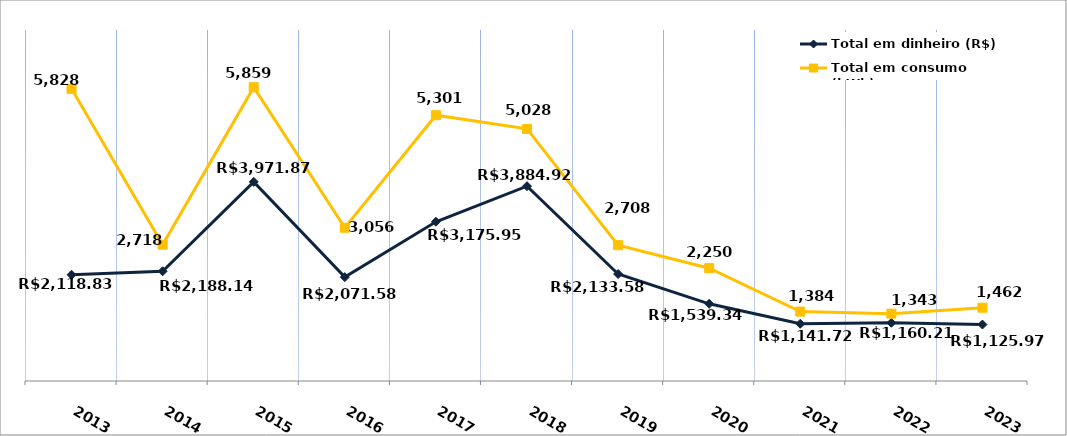
| Category | Total em dinheiro (R$) |
|---|---|
| 2013.0 | 2118.83 |
| 2014.0 | 2188.14 |
| 2015.0 | 3971.87 |
| 2016.0 | 2071.58 |
| 2017.0 | 3175.95 |
| 2018.0 | 3884.92 |
| 2019.0 | 2133.58 |
| 2020.0 | 1539.34 |
| 2021.0 | 1141.72 |
| 2022.0 | 1160.21 |
| 2023.0 | 1125.97 |